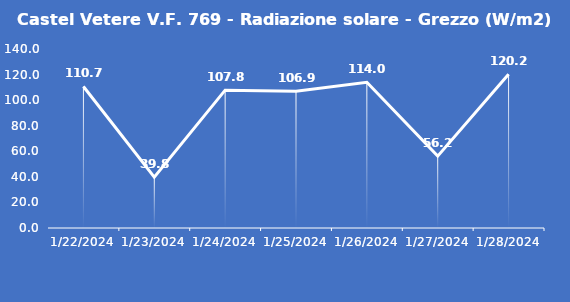
| Category | Castel Vetere V.F. 769 - Radiazione solare - Grezzo (W/m2) |
|---|---|
| 1/22/24 | 110.7 |
| 1/23/24 | 39.8 |
| 1/24/24 | 107.8 |
| 1/25/24 | 106.9 |
| 1/26/24 | 114 |
| 1/27/24 | 56.2 |
| 1/28/24 | 120.2 |